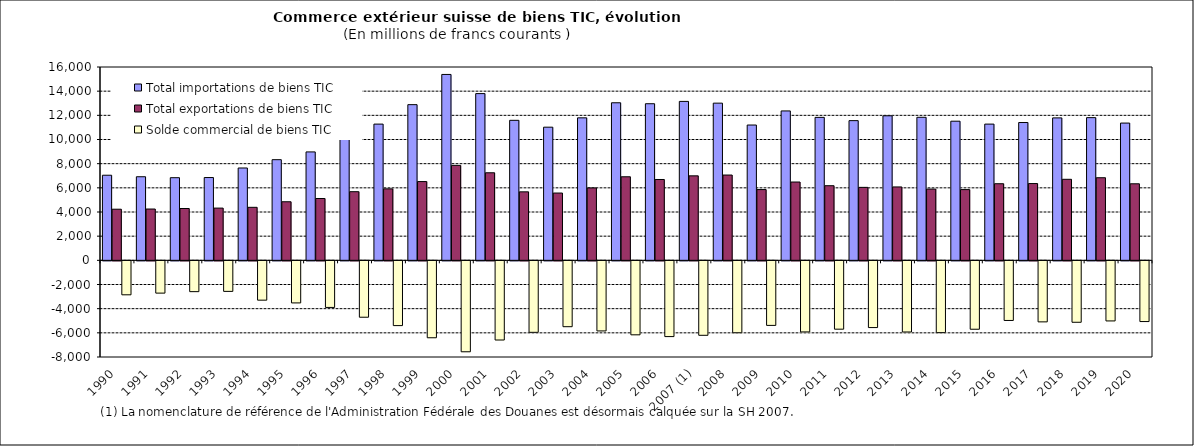
| Category | Total importations de biens TIC | Total exportations de biens TIC | Solde commercial de biens TIC |
|---|---|---|---|
| 1990 | 7043.215 | 4231.191 | -2812.025 |
| 1991 | 6918.332 | 4246.634 | -2671.698 |
| 1992 | 6838.565 | 4288.681 | -2549.884 |
| 1993 | 6851.701 | 4323.053 | -2528.648 |
| 1994 | 7642.126 | 4387.76 | -3254.366 |
| 1995 | 8330.021 | 4847.542 | -3482.479 |
| 1996 | 8972.833 | 5116.856 | -3855.977 |
| 1997 | 10347.863 | 5680.291 | -4667.572 |
| 1998 | 11273.785 | 5913.959 | -5359.826 |
| 1999 | 12883.689 | 6518.032 | -6365.657 |
| 2000 | 15383.908 | 7857.447 | -7526.461 |
| 2001 | 13799.08 | 7246.555 | -6552.524 |
| 2002 | 11586.772 | 5669.087 | -5917.685 |
| 2003 | 11019.238 | 5568.629 | -5450.609 |
| 2004 | 11793.307 | 5992.472 | -5800.835 |
| 2005 | 13038.922 | 6915.251 | -6123.671 |
| 2006 | 12959.973 | 6690.613 | -6269.36 |
| 2007 (1) | 13153.755 | 6991.103 | -6162.652 |
| 2008 | 13008.083 | 7058.679 | -5949.405 |
| 2009 | 11198.456 | 5854.826 | -5343.63 |
| 2010 | 12364.801 | 6480.846 | -5883.955 |
| 2011 | 11831.733 | 6176.012 | -5655.721 |
| 2012 | 11561.378 | 6037.969 | -5523.409 |
| 2013 | 11962.779 | 6073.654 | -5889.124 |
| 2014 | 11838.141 | 5896.203 | -5941.938 |
| 2015 | 11514.94 | 5854.068 | -5660.872 |
| 2016 | 11273.944 | 6339.533 | -4934.411 |
| 2017 | 11404.313 | 6353.539 | -5050.773 |
| 2018 | 11789.619 | 6705.546 | -5084.073 |
| 2019 | 11809.357 | 6836.165 | -4973.191 |
| 2020 | 11359.692 | 6334.668 | -5025.025 |